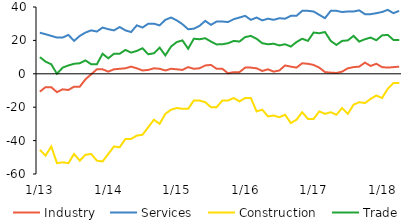
| Category | Industry | Services | Construction | Trade |
|---|---|---|---|---|
|  1/13 | -10.7 | 24.6 | -45.5 | 10 |
| 2 | -8 | 23.7 | -49 | 7.3 |
| 3 | -8 | 22.7 | -43.5 | 5.7 |
| 4 | -11 | 21.7 | -53.5 | 0 |
| 5 | -9.3 | 21.7 | -53 | 3.7 |
| 6 | -9.7 | 23.3 | -53.5 | 5 |
| 7 | -7.7 | 19.7 | -48 | 6 |
| 8 | -7.7 | 22.7 | -52 | 6.3 |
| 9 | -3.3 | 24.7 | -48.5 | 8 |
| 10 | -0.3 | 26 | -48 | 5.7 |
| 11 | 2.7 | 25.3 | -52 | 5.7 |
| 12 | 2.7 | 27.7 | -52.5 | 12 |
|  1/14 | 1.3 | 26.7 | -48 | 9.3 |
|  2 | 2.7 | 26 | -43.5 | 12 |
| 3 | 3 | 28 | -44 | 12 |
| 4 | 3.3 | 26 | -39 | 14.3 |
| 5 | 4.3 | 25 | -39 | 12.7 |
| 6 | 3.3 | 29 | -37 | 13.7 |
| 7 | 2 | 27.7 | -36.5 | 15.3 |
| 8 | 2.3 | 30 | -32 | 11.7 |
| 9 | 3.3 | 30 | -27.5 | 12.3 |
| 10 | 3 | 29 | -30 | 15.7 |
| 11 | 2 | 32.3 | -24 | 11 |
| 12 | 3 | 33.7 | -21.5 | 16.3 |
|  1/15 | 2.7 | 32 | -20.5 | 19 |
| 2 | 2.3 | 29.7 | -21 | 20 |
| 3 | 4 | 26.7 | -21 | 15 |
| 4 | 3 | 27 | -16 | 21 |
| 5 | 3.3 | 28.7 | -16 | 20.7 |
| 6 | 5 | 31.7 | -17 | 21.3 |
| 7 | 5.3 | 29.3 | -20 | 19.3 |
| 8 | 3 | 31.3 | -20 | 17.6 |
| 9 | 3 | 31.3 | -16 | 17.7 |
| 10 | 0.3 | 31 | -16 | 18.3 |
| 11 | 1 | 32.7 | -14.5 | 19.7 |
| 12 | 1 | 33.7 | -16.5 | 19.3 |
|  1/16 | 3.7 | 34.7 | -14.5 | 22 |
| 2 | 3.7 | 32.3 | -14.5 | 22.7 |
| 3 | 3.3 | 33.7 | -22.5 | 21 |
| 4 | 1.7 | 32 | -21.5 | 18.3 |
| 5 | 2.7 | 33 | -25.5 | 17.7 |
| 6 | 1.3 | 32.3 | -25 | 18 |
| 7 | 2 | 33.3 | -26 | 17 |
| 8 | 5 | 33 | -24.5 | 17.7 |
| 9 | 4.3 | 34.7 | -29.5 | 16.3 |
| 10 | 3.7 | 34.7 | -27.5 | 19 |
| 11 | 6.3 | 37.7 | -23 | 21 |
| 12 | 6 | 37.7 | -27 | 19.7 |
|  1/17 | 5.3 | 37.3 | -27 | 24.7 |
| 2 | 3.7 | 35.3 | -22.5 | 24.3 |
| 3 | 1 | 33.3 | -24 | 25 |
| 4 | 0.7 | 37.7 | -23 | 19.7 |
| 5 | 0.5 | 37.7 | -24.5 | 17.3 |
| 6 | 1.3 | 37 | -20.5 | 19.7 |
| 7 | 3.3 | 37.3 | -24 | 20 |
| 8 | 4 | 37.3 | -18.5 | 22.7 |
| 9 | 4.3 | 38 | -17 | 19.3 |
| 10 | 6.7 | 35.7 | -17.5 | 20.7 |
| 11 | 4.7 | 35.7 | -15 | 21.7 |
| 12 | 6 | 36.3 | -13 | 20.1 |
|  1/18 | 4 | 37 | -14.5 | 23 |
| 2 | 3.7 | 38.3 | -9 | 23.3 |
| 3 | 4 | 36.3 | -5.5 | 20.3 |
| 4 | 4.3 | 37.7 | -5.5 | 20.3 |